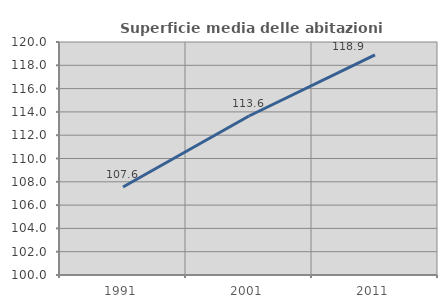
| Category | Superficie media delle abitazioni occupate |
|---|---|
| 1991.0 | 107.551 |
| 2001.0 | 113.647 |
| 2011.0 | 118.895 |